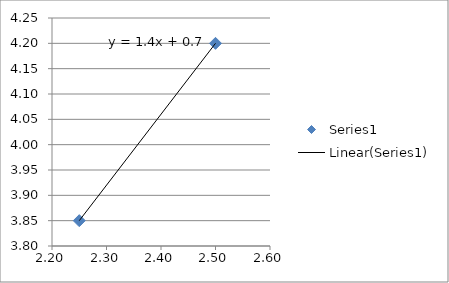
| Category | Series 0 |
|---|---|
| 2.25 | 3.85 |
| 2.5 | 4.2 |